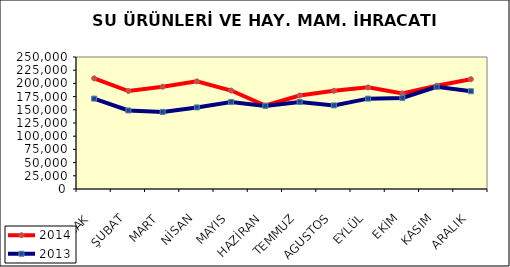
| Category | 2014 | 2013 |
|---|---|---|
| OCAK | 209570.804 | 171195.693 |
| ŞUBAT | 185581.57 | 148748.249 |
| MART | 193720.274 | 145990.751 |
| NİSAN | 203888.599 | 154505.486 |
| MAYIS | 186505.359 | 164850.53 |
| HAZİRAN | 158084.996 | 157449.192 |
| TEMMUZ | 177127.202 | 164865.727 |
| AGUSTOS | 185894.793 | 158340.295 |
| EYLÜL | 192468.723 | 171162.84 |
| EKİM | 180976.502 | 172493.792 |
| KASIM | 195692.005 | 193388.829 |
| ARALIK | 207955.867 | 185162.507 |